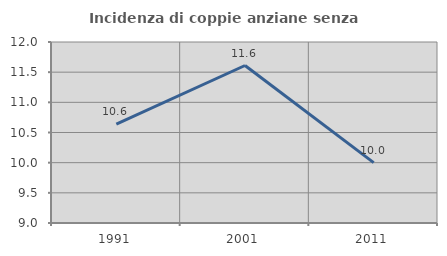
| Category | Incidenza di coppie anziane senza figli  |
|---|---|
| 1991.0 | 10.638 |
| 2001.0 | 11.61 |
| 2011.0 | 10 |